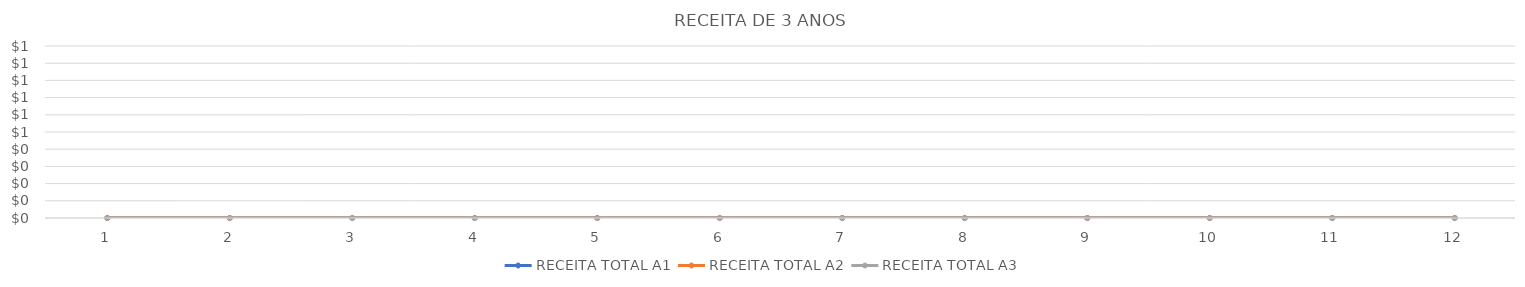
| Category | RECEITA TOTAL A1 | RECEITA TOTAL A2 | RECEITA TOTAL A3 |
|---|---|---|---|
| 0 | 0 | 0 | 0 |
| 1 | 0 | 0 | 0 |
| 2 | 0 | 0 | 0 |
| 3 | 0 | 0 | 0 |
| 4 | 0 | 0 | 0 |
| 5 | 0 | 0 | 0 |
| 6 | 0 | 0 | 0 |
| 7 | 0 | 0 | 0 |
| 8 | 0 | 0 | 0 |
| 9 | 0 | 0 | 0 |
| 10 | 0 | 0 | 0 |
| 11 | 0 | 0 | 0 |